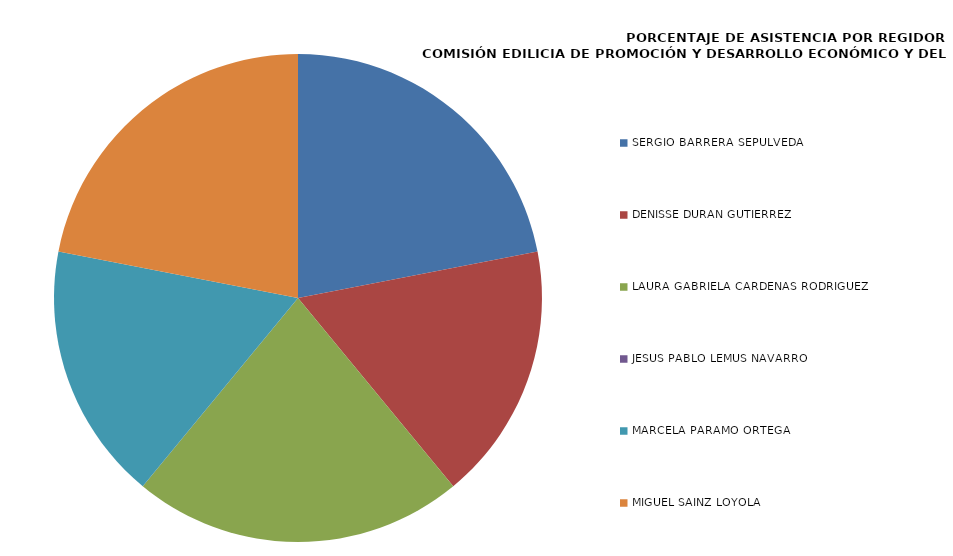
| Category | Series 0 |
|---|---|
| SERGIO BARRERA SEPÚLVEDA | 100 |
| DENISSE DURÁN GUTIÉRREZ | 77.778 |
| LAURA GABRIELA CÁRDENAS RODRÍGUEZ | 100 |
| JESÚS PABLO LEMUS NAVARRO | 0 |
| MARCELA PÁRAMO ORTEGA | 77.778 |
| MIGUEL SAINZ LOYOLA | 100 |